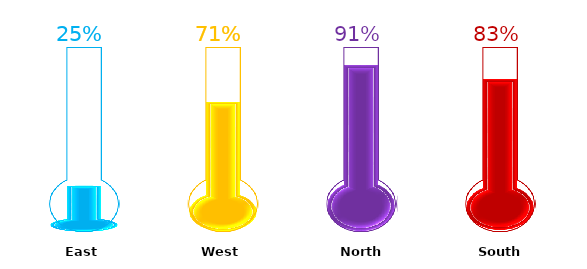
| Category | Service Level | Max |
|---|---|---|
| East | 0.25 | 1 |
| West | 0.71 | 1 |
| North | 0.91 | 1 |
| South | 0.83 | 1 |